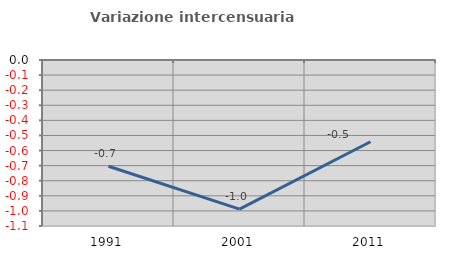
| Category | Variazione intercensuaria annua |
|---|---|
| 1991.0 | -0.704 |
| 2001.0 | -0.988 |
| 2011.0 | -0.542 |